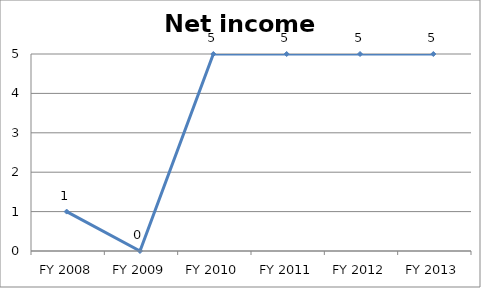
| Category | Net income score |
|---|---|
| FY 2013 | 5 |
| FY 2012 | 5 |
| FY 2011 | 5 |
| FY 2010 | 5 |
| FY 2009 | 0 |
| FY 2008 | 1 |